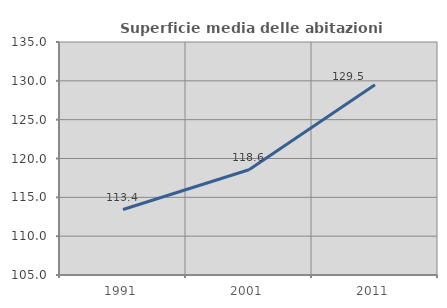
| Category | Superficie media delle abitazioni occupate |
|---|---|
| 1991.0 | 113.429 |
| 2001.0 | 118.558 |
| 2011.0 | 129.5 |